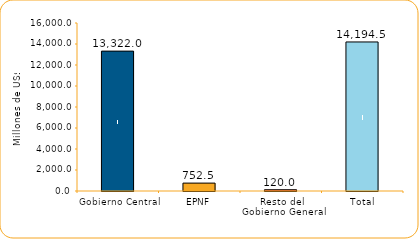
| Category | Series 1 |
|---|---|
| Gobierno Central | 13322 |
| EPNF | 752.5 |
| Resto del Gobierno General | 120 |
| Total | 14194.5 |